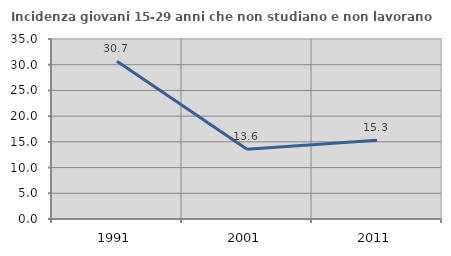
| Category | Incidenza giovani 15-29 anni che non studiano e non lavorano  |
|---|---|
| 1991.0 | 30.673 |
| 2001.0 | 13.577 |
| 2011.0 | 15.333 |